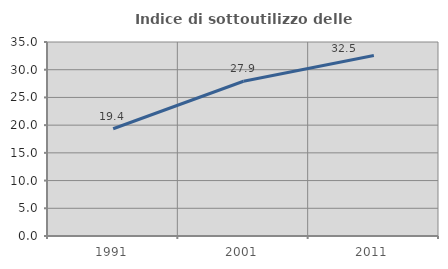
| Category | Indice di sottoutilizzo delle abitazioni  |
|---|---|
| 1991.0 | 19.352 |
| 2001.0 | 27.922 |
| 2011.0 | 32.547 |